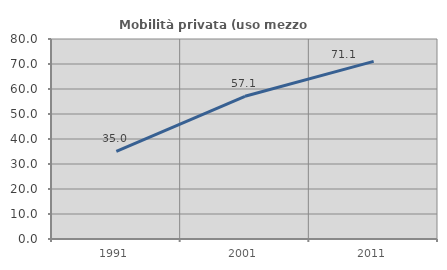
| Category | Mobilità privata (uso mezzo privato) |
|---|---|
| 1991.0 | 35.004 |
| 2001.0 | 57.08 |
| 2011.0 | 71.054 |